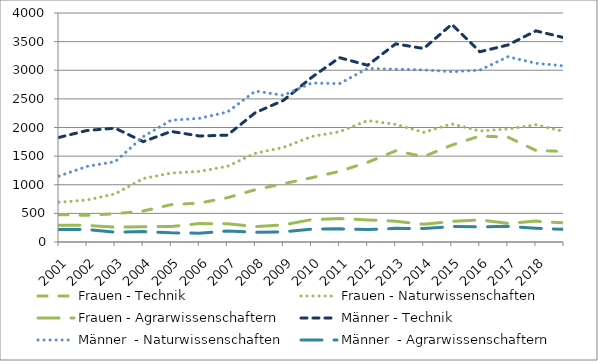
| Category | Frauen - Technik | Frauen - Naturwissenschaften | Frauen - Agrarwissenschaftern | Männer - Technik | Männer  - Naturwissenschaften | Männer  - Agrarwissenschaftern |
|---|---|---|---|---|---|---|
| 2001.0 | 477 | 694 | 292 | 1827 | 1152 | 217 |
| 2002.0 | 467 | 734 | 291 | 1948 | 1321 | 219 |
| 2003.0 | 493 | 841 | 258 | 1988 | 1403 | 172 |
| 2004.0 | 541 | 1108 | 266 | 1753 | 1840 | 182 |
| 2005.0 | 653 | 1204 | 272 | 1931 | 2128 | 161 |
| 2006.0 | 680 | 1233 | 322 | 1852 | 2159 | 153 |
| 2007.0 | 773 | 1322 | 319 | 1866 | 2270 | 192 |
| 2008.0 | 914 | 1550 | 270 | 2260 | 2636 | 168 |
| 2009.0 | 1018 | 1652 | 298 | 2474 | 2562 | 179 |
| 2010.0 | 1122 | 1842 | 391 | 2873 | 2776 | 226 |
| 2011.0 | 1234 | 1926 | 411 | 3220 | 2767 | 231 |
| 2012.0 | 1392 | 2121 | 386 | 3087 | 3032 | 217 |
| 2013.0 | 1592 | 2054 | 363 | 3461 | 3018 | 238 |
| 2014.0 | 1492 | 1916 | 310 | 3380 | 3006 | 234 |
| 2015.0 | 1693 | 2063 | 360 | 3803 | 2975 | 270 |
| 2016.0 | 1851 | 1939 | 387 | 3323 | 3001 | 265 |
| 2017.0 | 1832 | 1974 | 326 | 3441 | 3236 | 273 |
| 2018.0 | 1599 | 2047 | 365 | 3688 | 3122 | 242 |